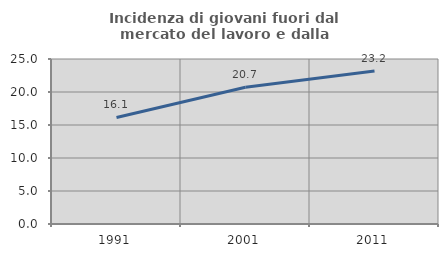
| Category | Incidenza di giovani fuori dal mercato del lavoro e dalla formazione  |
|---|---|
| 1991.0 | 16.146 |
| 2001.0 | 20.728 |
| 2011.0 | 23.167 |